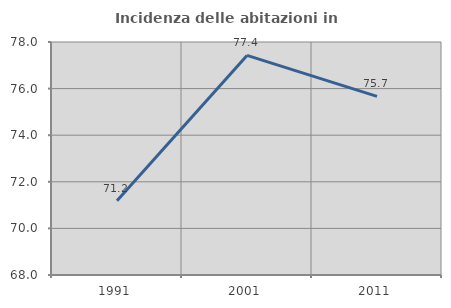
| Category | Incidenza delle abitazioni in proprietà  |
|---|---|
| 1991.0 | 71.192 |
| 2001.0 | 77.425 |
| 2011.0 | 75.669 |